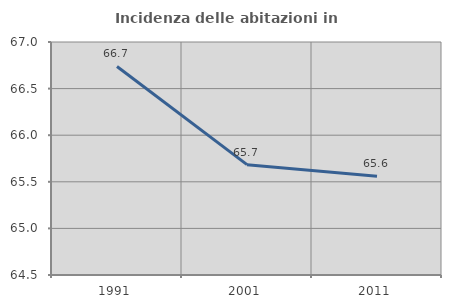
| Category | Incidenza delle abitazioni in proprietà  |
|---|---|
| 1991.0 | 66.738 |
| 2001.0 | 65.684 |
| 2011.0 | 65.56 |